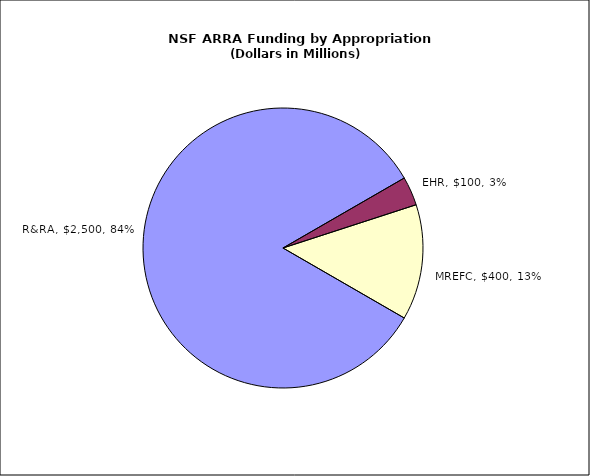
| Category | Series 0 |
|---|---|
| R&RA | 2500 |
| EHR | 100 |
| MREFC | 400 |